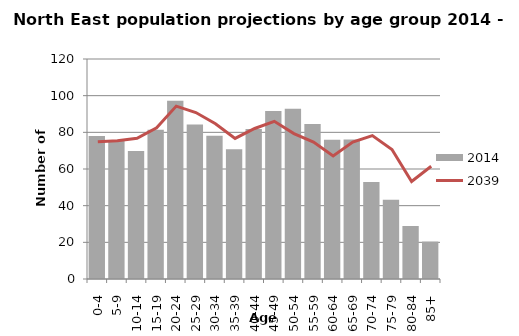
| Category | 2014 |
|---|---|
| 0-4 | 78 |
| 5-9 | 75.6 |
| 10-14 | 69.8 |
| 15-19 | 81.4 |
| 20-24 | 97.2 |
| 25-29 | 84.3 |
| 30-34 | 78.2 |
| 35-39 | 70.8 |
| 40-44 | 81.8 |
| 45-49 | 91.7 |
| 50-54 | 92.8 |
| 55-59 | 84.5 |
| 60-64 | 76 |
| 65-69 | 76.1 |
| 70-74 | 52.9 |
| 75-79 | 43.2 |
| 80-84 | 28.9 |
| 85+ | 20.4 |